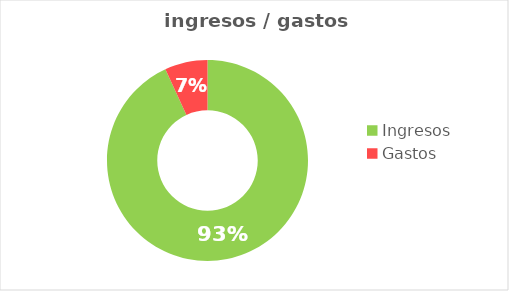
| Category | Series 0 |
|---|---|
| Ingresos | 6031.54 |
| Gastos | -445.88 |